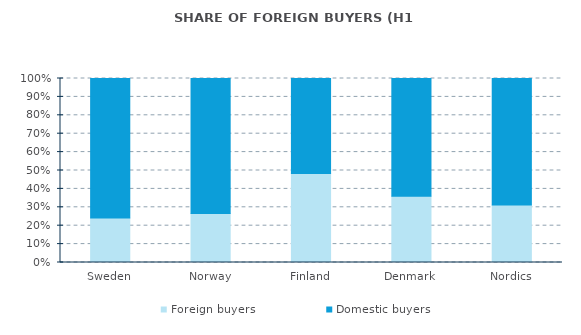
| Category | Foreign buyers | Domestic buyers |
|---|---|---|
| Sweden | 0.242 | 0.758 |
| Norway | 0.266 | 0.734 |
| Finland | 0.483 | 0.517 |
| Denmark | 0.36 | 0.64 |
| Nordics | 0.313 | 0.687 |